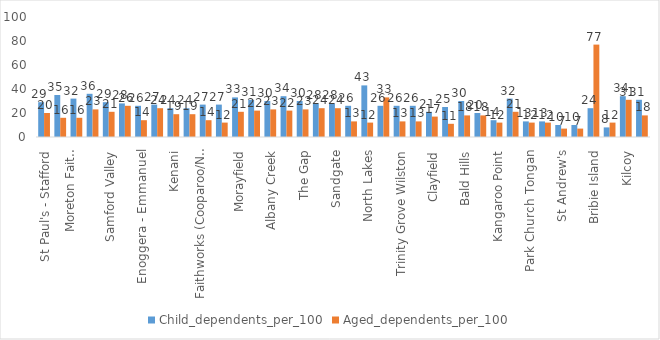
| Category | Child_dependents_per_100 | Aged_dependents_per_100 |
|---|---|---|
| St Paul's - Stafford | 29 | 20 |
| Pine Rivers | 35 | 16 |
| Moreton Faith Community | 32 | 16 |
| Caboolture | 36 | 23 |
| Samford Valley | 29 | 21 |
| Aspley | 28 | 26 |
| Enoggera - Emmanuel | 26 | 14 |
| Chermside Kedron | 27 | 24 |
| Kenani | 24 | 19 |
| Wavell Hts/Geebung | 24 | 19 |
| Faithworks (Cooparoo/Norman Park) | 27 | 14 |
| South East (Morningside) | 27 | 12 |
| Morayfield | 33 | 21 |
| Arana Hills | 31 | 22 |
| Albany Creek | 30 | 23 |
| Deception Bay | 34 | 22 |
| The Gap | 30 | 23 |
| Bracken Ridge | 28 | 24 |
| Sandgate | 28 | 24 |
| Ashgrove West | 26 | 13 |
| North Lakes | 43 | 12 |
| Redcliffe | 26 | 33 |
| Trinity Grove Wilston | 26 | 13 |
| Windsor | 26 | 13 |
| Clayfield | 21 | 17 |
| Bulimba | 25 | 11 |
| Bald Hills | 30 | 18 |
| St Luke's Hamilton | 20 | 18 |
| Kangaroo Point | 14 | 12 |
| Dayboro | 32 | 21 |
| Park Church Tongan | 13 | 12 |
| West End | 13 | 12 |
| St Andrew's | 10 | 7 |
| WMB Albert Street | 10 | 7 |
| Bribie Island | 24 | 77 |
| Merthyr Road | 8 | 12 |
| Kilcoy | 34 | 31 |
| Elimbah | 31 | 18 |